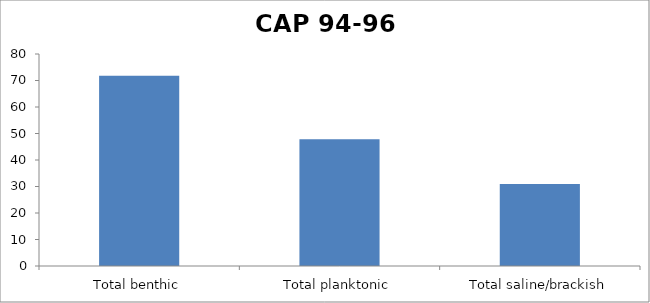
| Category | Abundance (%) |
|---|---|
| Total benthic | 71.761 |
| Total planktonic | 47.841 |
| Total saline/brackish | 30.897 |